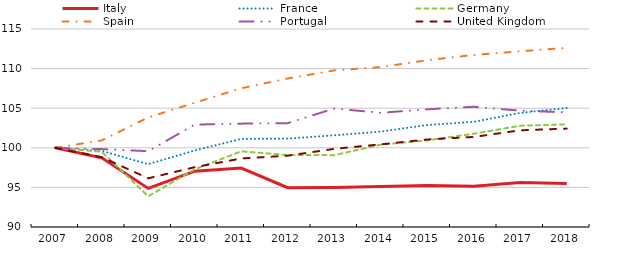
| Category | Italy | France | Germany | Spain | Portugal | United Kingdom |
|---|---|---|---|---|---|---|
| 2007.0 | 100 | 100 | 100 | 100 | 100 | 100 |
| 2008.0 | 98.737 | 99.613 | 99.503 | 100.932 | 99.833 | 98.812 |
| 2009.0 | 94.869 | 97.934 | 93.883 | 103.836 | 99.574 | 96.149 |
| 2010.0 | 97.051 | 99.663 | 97.286 | 105.688 | 102.93 | 97.552 |
| 2011.0 | 97.442 | 101.122 | 99.555 | 107.517 | 103.051 | 98.652 |
| 2012.0 | 94.961 | 101.164 | 99.086 | 108.75 | 103.115 | 99.004 |
| 2013.0 | 94.996 | 101.577 | 99.072 | 109.772 | 104.957 | 99.865 |
| 2014.0 | 95.113 | 102.047 | 100.396 | 110.193 | 104.421 | 100.435 |
| 2015.0 | 95.254 | 102.879 | 100.942 | 111.065 | 104.863 | 101.048 |
| 2016.0 | 95.154 | 103.281 | 101.771 | 111.724 | 105.182 | 101.37 |
| 2017.0 | 95.624 | 104.406 | 102.792 | 112.191 | 104.689 | 102.209 |
| 2018.0 | 95.504 | 105.029 | 102.96 | 112.62 | 104.47 | 102.424 |